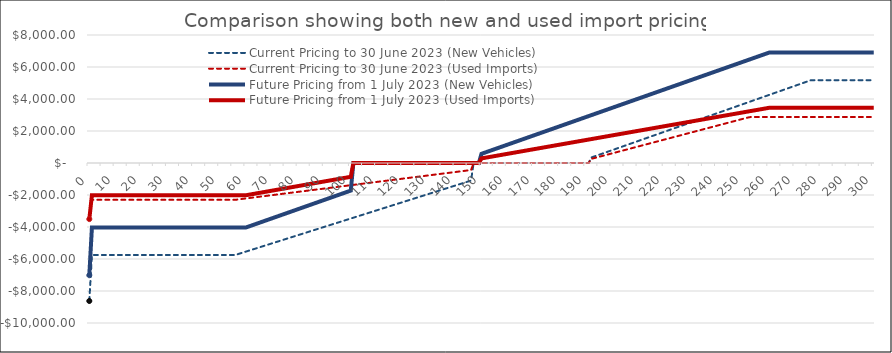
| Category |  Current Pricing to 30 June 2023 (New Vehicles)  |  Current Pricing to 30 June 2023 (Used Imports)  |  Future Pricing from 1 July 2023 (New Vehicles)  |  Future Pricing from 1 July 2023 (Used Imports)  |
|---|---|---|---|---|
| 0.0 | -8625 | -3450 | -7015 | -3507.5 |
| 1.0 | -5750 | -2300 | -4025 | -2012.5 |
| 2.0 | -5750 | -2300 | -4025 | -2012.5 |
| 3.0 | -5750 | -2300 | -4025 | -2012.5 |
| 4.0 | -5750 | -2300 | -4025 | -2012.5 |
| 5.0 | -5750 | -2300 | -4025 | -2012.5 |
| 6.0 | -5750 | -2300 | -4025 | -2012.5 |
| 7.0 | -5750 | -2300 | -4025 | -2012.5 |
| 8.0 | -5750 | -2300 | -4025 | -2012.5 |
| 9.0 | -5750 | -2300 | -4025 | -2012.5 |
| 10.0 | -5750 | -2300 | -4025 | -2012.5 |
| 11.0 | -5750 | -2300 | -4025 | -2012.5 |
| 12.0 | -5750 | -2300 | -4025 | -2012.5 |
| 13.0 | -5750 | -2300 | -4025 | -2012.5 |
| 14.0 | -5750 | -2300 | -4025 | -2012.5 |
| 15.0 | -5750 | -2300 | -4025 | -2012.5 |
| 16.0 | -5750 | -2300 | -4025 | -2012.5 |
| 17.0 | -5750 | -2300 | -4025 | -2012.5 |
| 18.0 | -5750 | -2300 | -4025 | -2012.5 |
| 19.0 | -5750 | -2300 | -4025 | -2012.5 |
| 20.0 | -5750 | -2300 | -4025 | -2012.5 |
| 21.0 | -5750 | -2300 | -4025 | -2012.5 |
| 22.0 | -5750 | -2300 | -4025 | -2012.5 |
| 23.0 | -5750 | -2300 | -4025 | -2012.5 |
| 24.0 | -5750 | -2300 | -4025 | -2012.5 |
| 25.0 | -5750 | -2300 | -4025 | -2012.5 |
| 26.0 | -5750 | -2300 | -4025 | -2012.5 |
| 27.0 | -5750 | -2300 | -4025 | -2012.5 |
| 28.0 | -5750 | -2300 | -4025 | -2012.5 |
| 29.0 | -5750 | -2300 | -4025 | -2012.5 |
| 30.0 | -5750 | -2300 | -4025 | -2012.5 |
| 31.0 | -5750 | -2300 | -4025 | -2012.5 |
| 32.0 | -5750 | -2300 | -4025 | -2012.5 |
| 33.0 | -5750 | -2300 | -4025 | -2012.5 |
| 34.0 | -5750 | -2300 | -4025 | -2012.5 |
| 35.0 | -5750 | -2300 | -4025 | -2012.5 |
| 36.0 | -5750 | -2300 | -4025 | -2012.5 |
| 37.0 | -5750 | -2300 | -4025 | -2012.5 |
| 38.0 | -5750 | -2300 | -4025 | -2012.5 |
| 39.0 | -5750 | -2300 | -4025 | -2012.5 |
| 40.0 | -5750 | -2300 | -4025 | -2012.5 |
| 41.0 | -5750 | -2300 | -4025 | -2012.5 |
| 42.0 | -5750 | -2300 | -4025 | -2012.5 |
| 43.0 | -5750 | -2300 | -4025 | -2012.5 |
| 44.0 | -5750 | -2300 | -4025 | -2012.5 |
| 45.0 | -5750 | -2300 | -4025 | -2012.5 |
| 46.0 | -5750 | -2300 | -4025 | -2012.5 |
| 47.0 | -5750 | -2300 | -4025 | -2012.5 |
| 48.0 | -5750 | -2300 | -4025 | -2012.5 |
| 49.0 | -5750 | -2300 | -4025 | -2012.5 |
| 50.0 | -5750 | -2300 | -4025 | -2012.5 |
| 51.0 | -5750 | -2300 | -4025 | -2012.5 |
| 52.0 | -5750 | -2300 | -4025 | -2012.5 |
| 53.0 | -5750 | -2300 | -4025 | -2012.5 |
| 54.0 | -5750 | -2300 | -4025 | -2012.5 |
| 55.0 | -5750 | -2300 | -4025 | -2012.5 |
| 56.0 | -5750 | -2300 | -4025 | -2012.5 |
| 57.0 | -5686.552 | -2274.621 | -4025 | -2012.5 |
| 58.0 | -5635 | -2254 | -4025 | -2012.5 |
| 59.0 | -5583.448 | -2233.379 | -4025 | -2012.5 |
| 60.0 | -5531.897 | -2212.759 | -4025 | -2012.5 |
| 61.0 | -5480.345 | -2192.138 | -3967.5 | -1983.75 |
| 62.0 | -5428.793 | -2171.517 | -3910 | -1955 |
| 63.0 | -5377.241 | -2150.897 | -3852.5 | -1926.25 |
| 64.0 | -5325.69 | -2130.276 | -3795 | -1897.5 |
| 65.0 | -5274.138 | -2109.655 | -3737.5 | -1868.75 |
| 66.0 | -5222.586 | -2089.034 | -3680 | -1840 |
| 67.0 | -5171.034 | -2068.414 | -3622.5 | -1811.25 |
| 68.0 | -5119.483 | -2047.793 | -3565 | -1782.5 |
| 69.0 | -5067.931 | -2027.172 | -3507.5 | -1753.75 |
| 70.0 | -5016.379 | -2006.552 | -3450 | -1725 |
| 71.0 | -4964.828 | -1985.931 | -3392.5 | -1696.25 |
| 72.0 | -4913.276 | -1965.31 | -3335 | -1667.5 |
| 73.0 | -4861.724 | -1944.69 | -3277.5 | -1638.75 |
| 74.0 | -4810.172 | -1924.069 | -3220 | -1610 |
| 75.0 | -4758.621 | -1903.448 | -3162.5 | -1581.25 |
| 76.0 | -4707.069 | -1882.828 | -3105 | -1552.5 |
| 77.0 | -4655.517 | -1862.207 | -3047.5 | -1523.75 |
| 78.0 | -4603.966 | -1841.586 | -2990 | -1495 |
| 79.0 | -4552.414 | -1820.966 | -2932.5 | -1466.25 |
| 80.0 | -4500.862 | -1800.345 | -2875 | -1437.5 |
| 81.0 | -4449.31 | -1779.724 | -2817.5 | -1408.75 |
| 82.0 | -4397.759 | -1759.103 | -2760 | -1380 |
| 83.0 | -4346.207 | -1738.483 | -2702.5 | -1351.25 |
| 84.0 | -4294.655 | -1717.862 | -2645 | -1322.5 |
| 85.0 | -4243.103 | -1697.241 | -2587.5 | -1293.75 |
| 86.0 | -4191.552 | -1676.621 | -2530 | -1265 |
| 87.0 | -4140 | -1656 | -2472.5 | -1236.25 |
| 88.0 | -4088.448 | -1635.379 | -2415 | -1207.5 |
| 89.0 | -4036.897 | -1614.759 | -2357.5 | -1178.75 |
| 90.0 | -3985.345 | -1594.138 | -2300 | -1150 |
| 91.0 | -3933.793 | -1573.517 | -2242.5 | -1121.25 |
| 92.0 | -3882.241 | -1552.897 | -2185 | -1092.5 |
| 93.0 | -3830.69 | -1532.276 | -2127.5 | -1063.75 |
| 94.0 | -3779.138 | -1511.655 | -2070 | -1035 |
| 95.0 | -3727.586 | -1491.034 | -2012.5 | -1006.25 |
| 96.0 | -3676.034 | -1470.414 | -1955 | -977.5 |
| 97.0 | -3624.483 | -1449.793 | -1897.5 | -948.75 |
| 98.0 | -3572.931 | -1429.172 | -1840 | -920 |
| 99.0 | -3521.379 | -1408.552 | -1782.5 | -891.25 |
| 100.0 | -3469.828 | -1387.931 | -1725 | -862.5 |
| 101.0 | -3418.276 | -1367.31 | 0 | 0 |
| 102.0 | -3366.724 | -1346.69 | 0 | 0 |
| 103.0 | -3315.172 | -1326.069 | 0 | 0 |
| 104.0 | -3263.621 | -1305.448 | 0 | 0 |
| 105.0 | -3212.069 | -1284.828 | 0 | 0 |
| 106.0 | -3160.517 | -1264.207 | 0 | 0 |
| 107.0 | -3108.966 | -1243.586 | 0 | 0 |
| 108.0 | -3057.414 | -1222.966 | 0 | 0 |
| 109.0 | -3005.862 | -1202.345 | 0 | 0 |
| 110.0 | -2954.31 | -1181.724 | 0 | 0 |
| 111.0 | -2902.759 | -1161.103 | 0 | 0 |
| 112.0 | -2851.207 | -1140.483 | 0 | 0 |
| 113.0 | -2799.655 | -1119.862 | 0 | 0 |
| 114.0 | -2748.103 | -1099.241 | 0 | 0 |
| 115.0 | -2696.552 | -1078.621 | 0 | 0 |
| 116.0 | -2645 | -1058 | 0 | 0 |
| 117.0 | -2593.448 | -1037.379 | 0 | 0 |
| 118.0 | -2541.897 | -1016.759 | 0 | 0 |
| 119.0 | -2490.345 | -996.138 | 0 | 0 |
| 120.0 | -2438.793 | -975.517 | 0 | 0 |
| 121.0 | -2387.241 | -954.897 | 0 | 0 |
| 122.0 | -2335.69 | -934.276 | 0 | 0 |
| 123.0 | -2284.138 | -913.655 | 0 | 0 |
| 124.0 | -2232.586 | -893.034 | 0 | 0 |
| 125.0 | -2181.034 | -872.414 | 0 | 0 |
| 126.0 | -2129.483 | -851.793 | 0 | 0 |
| 127.0 | -2077.931 | -831.172 | 0 | 0 |
| 128.0 | -2026.379 | -810.552 | 0 | 0 |
| 129.0 | -1974.828 | -789.931 | 0 | 0 |
| 130.0 | -1923.276 | -769.31 | 0 | 0 |
| 131.0 | -1871.724 | -748.69 | 0 | 0 |
| 132.0 | -1820.172 | -728.069 | 0 | 0 |
| 133.0 | -1768.621 | -707.448 | 0 | 0 |
| 134.0 | -1717.069 | -686.828 | 0 | 0 |
| 135.0 | -1665.517 | -666.207 | 0 | 0 |
| 136.0 | -1613.966 | -645.586 | 0 | 0 |
| 137.0 | -1562.414 | -624.966 | 0 | 0 |
| 138.0 | -1510.862 | -604.345 | 0 | 0 |
| 139.0 | -1459.31 | -583.724 | 0 | 0 |
| 140.0 | -1407.759 | -563.103 | 0 | 0 |
| 141.0 | -1356.207 | -542.483 | 0 | 0 |
| 142.0 | -1304.655 | -521.862 | 0 | 0 |
| 143.0 | -1253.103 | -501.241 | 0 | 0 |
| 144.0 | -1201.552 | -480.621 | 0 | 0 |
| 145.0 | -1150 | -460 | 0 | 0 |
| 146.0 | -1098.448 | -439.379 | 0 | 0 |
| 147.0 | 0 | 0 | 0 | 0 |
| 148.0 | 0 | 0 | 0 | 0 |
| 149.0 | 0 | 0 | 0 | 0 |
| 150.0 | 0 | 0 | 575 | 287.5 |
| 151.0 | 0 | 0 | 632.5 | 316.25 |
| 152.0 | 0 | 0 | 690 | 345 |
| 153.0 | 0 | 0 | 747.5 | 373.75 |
| 154.0 | 0 | 0 | 805 | 402.5 |
| 155.0 | 0 | 0 | 862.5 | 431.25 |
| 156.0 | 0 | 0 | 920 | 460 |
| 157.0 | 0 | 0 | 977.5 | 488.75 |
| 158.0 | 0 | 0 | 1035 | 517.5 |
| 159.0 | 0 | 0 | 1092.5 | 546.25 |
| 160.0 | 0 | 0 | 1150 | 575 |
| 161.0 | 0 | 0 | 1207.5 | 603.75 |
| 162.0 | 0 | 0 | 1265 | 632.5 |
| 163.0 | 0 | 0 | 1322.5 | 661.25 |
| 164.0 | 0 | 0 | 1380 | 690 |
| 165.0 | 0 | 0 | 1437.5 | 718.75 |
| 166.0 | 0 | 0 | 1495 | 747.5 |
| 167.0 | 0 | 0 | 1552.5 | 776.25 |
| 168.0 | 0 | 0 | 1610 | 805 |
| 169.0 | 0 | 0 | 1667.5 | 833.75 |
| 170.0 | 0 | 0 | 1725 | 862.5 |
| 171.0 | 0 | 0 | 1782.5 | 891.25 |
| 172.0 | 0 | 0 | 1840 | 920 |
| 173.0 | 0 | 0 | 1897.5 | 948.75 |
| 174.0 | 0 | 0 | 1955 | 977.5 |
| 175.0 | 0 | 0 | 2012.5 | 1006.25 |
| 176.0 | 0 | 0 | 2070 | 1035 |
| 177.0 | 0 | 0 | 2127.5 | 1063.75 |
| 178.0 | 0 | 0 | 2185 | 1092.5 |
| 179.0 | 0 | 0 | 2242.5 | 1121.25 |
| 180.0 | 0 | 0 | 2300 | 1150 |
| 181.0 | 0 | 0 | 2357.5 | 1178.75 |
| 182.0 | 0 | 0 | 2415 | 1207.5 |
| 183.0 | 0 | 0 | 2472.5 | 1236.25 |
| 184.0 | 0 | 0 | 2530 | 1265 |
| 185.0 | 0 | 0 | 2587.5 | 1293.75 |
| 186.0 | 0 | 0 | 2645 | 1322.5 |
| 187.0 | 0 | 0 | 2702.5 | 1351.25 |
| 188.0 | 0 | 0 | 2760 | 1380 |
| 189.0 | 0 | 0 | 2817.5 | 1408.75 |
| 190.0 | 0 | 0 | 2875 | 1437.5 |
| 191.0 | 0 | 0 | 2932.5 | 1466.25 |
| 192.0 | 345 | 258.75 | 2990 | 1495 |
| 193.0 | 402.5 | 301.875 | 3047.5 | 1523.75 |
| 194.0 | 460 | 345 | 3105 | 1552.5 |
| 195.0 | 517.5 | 388.125 | 3162.5 | 1581.25 |
| 196.0 | 575 | 431.25 | 3220 | 1610 |
| 197.0 | 632.5 | 474.375 | 3277.5 | 1638.75 |
| 198.0 | 690 | 517.5 | 3335 | 1667.5 |
| 199.0 | 747.5 | 560.625 | 3392.5 | 1696.25 |
| 200.0 | 805 | 603.75 | 3450 | 1725 |
| 201.0 | 862.5 | 646.875 | 3507.5 | 1753.75 |
| 202.0 | 920 | 690 | 3565 | 1782.5 |
| 203.0 | 977.5 | 733.125 | 3622.5 | 1811.25 |
| 204.0 | 1035 | 776.25 | 3680 | 1840 |
| 205.0 | 1092.5 | 819.375 | 3737.5 | 1868.75 |
| 206.0 | 1150 | 862.5 | 3795 | 1897.5 |
| 207.0 | 1207.5 | 905.625 | 3852.5 | 1926.25 |
| 208.0 | 1265 | 948.75 | 3910 | 1955 |
| 209.0 | 1322.5 | 991.875 | 3967.5 | 1983.75 |
| 210.0 | 1380 | 1035 | 4025 | 2012.5 |
| 211.0 | 1437.5 | 1078.125 | 4082.5 | 2041.25 |
| 212.0 | 1495 | 1121.25 | 4140 | 2070 |
| 213.0 | 1552.5 | 1164.375 | 4197.5 | 2098.75 |
| 214.0 | 1610 | 1207.5 | 4255 | 2127.5 |
| 215.0 | 1667.5 | 1250.625 | 4312.5 | 2156.25 |
| 216.0 | 1725 | 1293.75 | 4370 | 2185 |
| 217.0 | 1782.5 | 1336.875 | 4427.5 | 2213.75 |
| 218.0 | 1840 | 1380 | 4485 | 2242.5 |
| 219.0 | 1897.5 | 1423.125 | 4542.5 | 2271.25 |
| 220.0 | 1955 | 1466.25 | 4600 | 2300 |
| 221.0 | 2012.5 | 1509.375 | 4657.5 | 2328.75 |
| 222.0 | 2070 | 1552.5 | 4715 | 2357.5 |
| 223.0 | 2127.5 | 1595.625 | 4772.5 | 2386.25 |
| 224.0 | 2185 | 1638.75 | 4830 | 2415 |
| 225.0 | 2242.5 | 1681.875 | 4887.5 | 2443.75 |
| 226.0 | 2300 | 1725 | 4945 | 2472.5 |
| 227.0 | 2357.5 | 1768.125 | 5002.5 | 2501.25 |
| 228.0 | 2415 | 1811.25 | 5060 | 2530 |
| 229.0 | 2472.5 | 1854.375 | 5117.5 | 2558.75 |
| 230.0 | 2530 | 1897.5 | 5175 | 2587.5 |
| 231.0 | 2587.5 | 1940.625 | 5232.5 | 2616.25 |
| 232.0 | 2645 | 1983.75 | 5290 | 2645 |
| 233.0 | 2702.5 | 2026.875 | 5347.5 | 2673.75 |
| 234.0 | 2760 | 2070 | 5405 | 2702.5 |
| 235.0 | 2817.5 | 2113.125 | 5462.5 | 2731.25 |
| 236.0 | 2875 | 2156.25 | 5520 | 2760 |
| 237.0 | 2932.5 | 2199.375 | 5577.5 | 2788.75 |
| 238.0 | 2990 | 2242.5 | 5635 | 2817.5 |
| 239.0 | 3047.5 | 2285.625 | 5692.5 | 2846.25 |
| 240.0 | 3105 | 2328.75 | 5750 | 2875 |
| 241.0 | 3162.5 | 2371.875 | 5807.5 | 2903.75 |
| 242.0 | 3220 | 2415 | 5865 | 2932.5 |
| 243.0 | 3277.5 | 2458.125 | 5922.5 | 2961.25 |
| 244.0 | 3335 | 2501.25 | 5980 | 2990 |
| 245.0 | 3392.5 | 2544.375 | 6037.5 | 3018.75 |
| 246.0 | 3450 | 2587.5 | 6095 | 3047.5 |
| 247.0 | 3507.5 | 2630.625 | 6152.5 | 3076.25 |
| 248.0 | 3565 | 2673.75 | 6210 | 3105 |
| 249.0 | 3622.5 | 2716.875 | 6267.5 | 3133.75 |
| 250.0 | 3680 | 2760 | 6325 | 3162.5 |
| 251.0 | 3737.5 | 2803.125 | 6382.5 | 3191.25 |
| 252.0 | 3795 | 2846.25 | 6440 | 3220 |
| 253.0 | 3852.5 | 2875 | 6497.5 | 3248.75 |
| 254.0 | 3910 | 2875 | 6555 | 3277.5 |
| 255.0 | 3967.5 | 2875 | 6612.5 | 3306.25 |
| 256.0 | 4025 | 2875 | 6670 | 3335 |
| 257.0 | 4082.5 | 2875 | 6727.5 | 3363.75 |
| 258.0 | 4140 | 2875 | 6785 | 3392.5 |
| 259.0 | 4197.5 | 2875 | 6842.5 | 3421.25 |
| 260.0 | 4255 | 2875 | 6900 | 3450 |
| 261.0 | 4312.5 | 2875 | 6900 | 3450 |
| 262.0 | 4370 | 2875 | 6900 | 3450 |
| 263.0 | 4427.5 | 2875 | 6900 | 3450 |
| 264.0 | 4485 | 2875 | 6900 | 3450 |
| 265.0 | 4542.5 | 2875 | 6900 | 3450 |
| 266.0 | 4600 | 2875 | 6900 | 3450 |
| 267.0 | 4657.5 | 2875 | 6900 | 3450 |
| 268.0 | 4715 | 2875 | 6900 | 3450 |
| 269.0 | 4772.5 | 2875 | 6900 | 3450 |
| 270.0 | 4830 | 2875 | 6900 | 3450 |
| 271.0 | 4887.5 | 2875 | 6900 | 3450 |
| 272.0 | 4945 | 2875 | 6900 | 3450 |
| 273.0 | 5002.5 | 2875 | 6900 | 3450 |
| 274.0 | 5060 | 2875 | 6900 | 3450 |
| 275.0 | 5117.5 | 2875 | 6900 | 3450 |
| 276.0 | 5175 | 2875 | 6900 | 3450 |
| 277.0 | 5175 | 2875 | 6900 | 3450 |
| 278.0 | 5175 | 2875 | 6900 | 3450 |
| 279.0 | 5175 | 2875 | 6900 | 3450 |
| 280.0 | 5175 | 2875 | 6900 | 3450 |
| 281.0 | 5175 | 2875 | 6900 | 3450 |
| 282.0 | 5175 | 2875 | 6900 | 3450 |
| 283.0 | 5175 | 2875 | 6900 | 3450 |
| 284.0 | 5175 | 2875 | 6900 | 3450 |
| 285.0 | 5175 | 2875 | 6900 | 3450 |
| 286.0 | 5175 | 2875 | 6900 | 3450 |
| 287.0 | 5175 | 2875 | 6900 | 3450 |
| 288.0 | 5175 | 2875 | 6900 | 3450 |
| 289.0 | 5175 | 2875 | 6900 | 3450 |
| 290.0 | 5175 | 2875 | 6900 | 3450 |
| 291.0 | 5175 | 2875 | 6900 | 3450 |
| 292.0 | 5175 | 2875 | 6900 | 3450 |
| 293.0 | 5175 | 2875 | 6900 | 3450 |
| 294.0 | 5175 | 2875 | 6900 | 3450 |
| 295.0 | 5175 | 2875 | 6900 | 3450 |
| 296.0 | 5175 | 2875 | 6900 | 3450 |
| 297.0 | 5175 | 2875 | 6900 | 3450 |
| 298.0 | 5175 | 2875 | 6900 | 3450 |
| 299.0 | 5175 | 2875 | 6900 | 3450 |
| 300.0 | 5175 | 2875 | 6900 | 3450 |